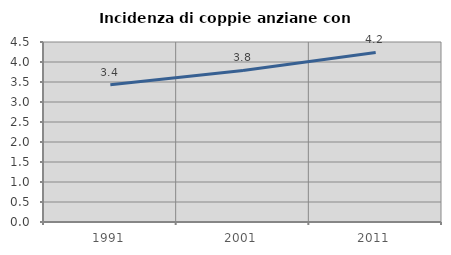
| Category | Incidenza di coppie anziane con figli |
|---|---|
| 1991.0 | 3.429 |
| 2001.0 | 3.789 |
| 2011.0 | 4.238 |